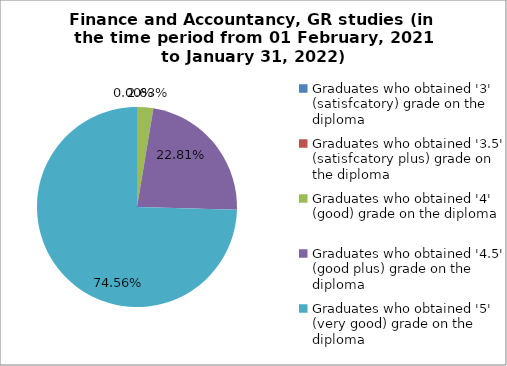
| Category | Series 1 |
|---|---|
| Graduates who obtained '3' (satisfcatory) grade on the diploma  | 0 |
| Graduates who obtained '3.5' (satisfcatory plus) grade on the diploma  | 0 |
| Graduates who obtained '4' (good) grade on the diploma  | 2.632 |
| Graduates who obtained '4.5' (good plus) grade on the diploma  | 22.807 |
| Graduates who obtained '5' (very good) grade on the diploma  | 74.561 |